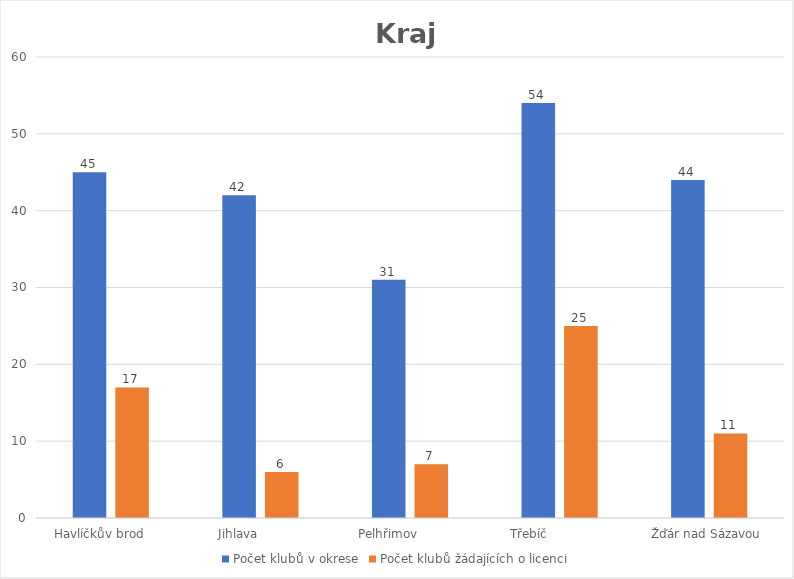
| Category | Počet klubů v okrese | Počet klubů žádajících o licenci |
|---|---|---|
| Havlíčkův brod      | 45 | 17 |
| Jihlava            | 42 | 6 |
| Pelhřimov            | 31 | 7 |
| Třebíč                | 54 | 25 |
| Žďár nad Sázavou  | 44 | 11 |